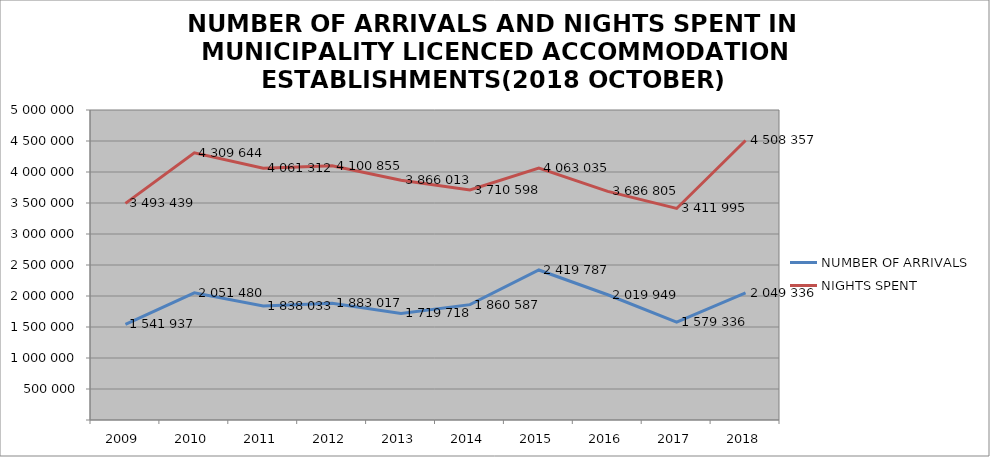
| Category | NUMBER OF ARRIVALS | NIGHTS SPENT |
|---|---|---|
| 2009 | 1541937 | 3493439 |
| 2010 | 2051480 | 4309644 |
| 2011 | 1838033 | 4061312 |
| 2012 | 1883017 | 4100855 |
| 2013 | 1719718 | 3866013 |
| 2014 | 1860587 | 3710598 |
| 2015 | 2419787 | 4063035 |
| 2016 | 2019949 | 3686805 |
| 2017 | 1579336 | 3411995 |
| 2018 | 2049336 | 4508357 |